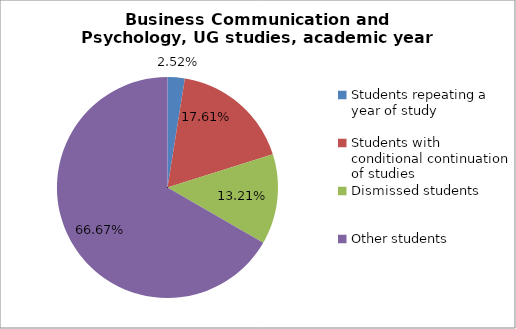
| Category | Series 0 |
|---|---|
| Students repeating a year of study | 4 |
| Students with conditional continuation of studies | 28 |
| Dismissed students | 21 |
| Other students | 106 |